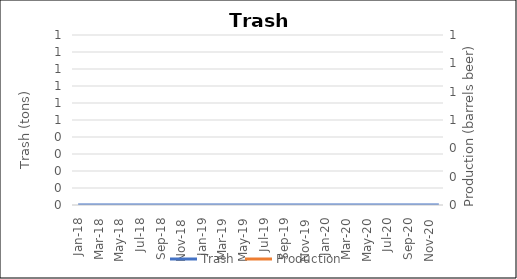
| Category | Trash |
|---|---|
| Jan-18 | 0 |
| Feb-18 | 0 |
| Mar-18 | 0 |
| Apr-18 | 0 |
| May-18 | 0 |
| Jun-18 | 0 |
| Jul-18 | 0 |
| Aug-18 | 0 |
| Sep-18 | 0 |
| Oct-18 | 0 |
| Nov-18 | 0 |
| Dec-18 | 0 |
| Jan-19 | 0 |
| Feb-19 | 0 |
| Mar-19 | 0 |
| Apr-19 | 0 |
| May-19 | 0 |
| Jun-19 | 0 |
| Jul-19 | 0 |
| Aug-19 | 0 |
| Sep-19 | 0 |
| Oct-19 | 0 |
| Nov-19 | 0 |
| Dec-19 | 0 |
| Jan-20 | 0 |
| Feb-20 | 0 |
| Mar-20 | 0 |
| Apr-20 | 0 |
| May-20 | 0 |
| Jun-20 | 0 |
| Jul-20 | 0 |
| Aug-20 | 0 |
| Sep-20 | 0 |
| Oct-20 | 0 |
| Nov-20 | 0 |
| Dec-20 | 0 |